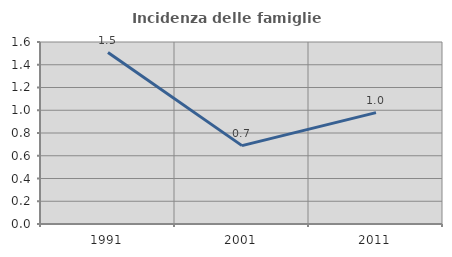
| Category | Incidenza delle famiglie numerose |
|---|---|
| 1991.0 | 1.507 |
| 2001.0 | 0.689 |
| 2011.0 | 0.979 |